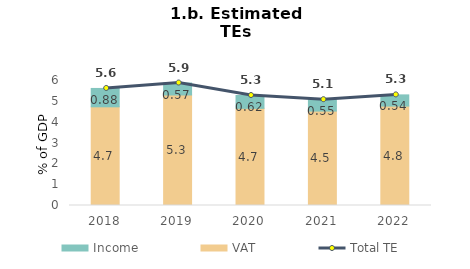
| Category | VAT | Income |
|---|---|---|
| 2018.0 | 4.737 | 0.881 |
| 2019.0 | 5.305 | 0.574 |
| 2020.0 | 4.663 | 0.616 |
| 2021.0 | 4.532 | 0.548 |
| 2022.0 | 4.772 | 0.537 |